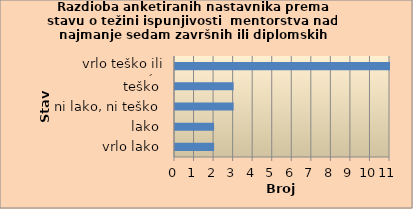
| Category | Series 0 |
|---|---|
| vrlo lako | 2 |
| lako | 2 |
| ni lako, ni teško | 3 |
| teško | 3 |
| vrlo teško ili nemoguće | 11 |